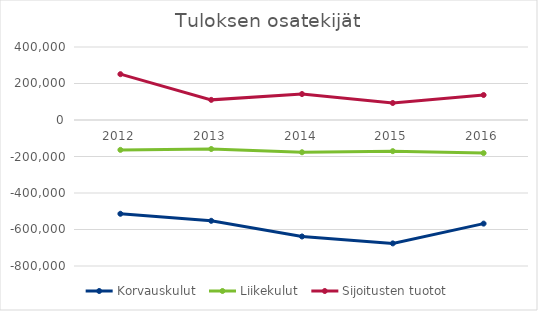
| Category | Korvauskulut  | Liikekulut  | Sijoitusten tuotot |
|---|---|---|---|
| 2012.0 | -513847.063 | -163703.581 | 251118.55 |
| 2013.0 | -552395.653 | -158967.618 | 110313.736 |
| 2014.0 | -638213.637 | -176717.549 | 142229.83 |
| 2015.0 | -676123.704 | -170689.252 | 93180.658 |
| 2016.0 | -567723.432 | -181388.116 | 136892.294 |